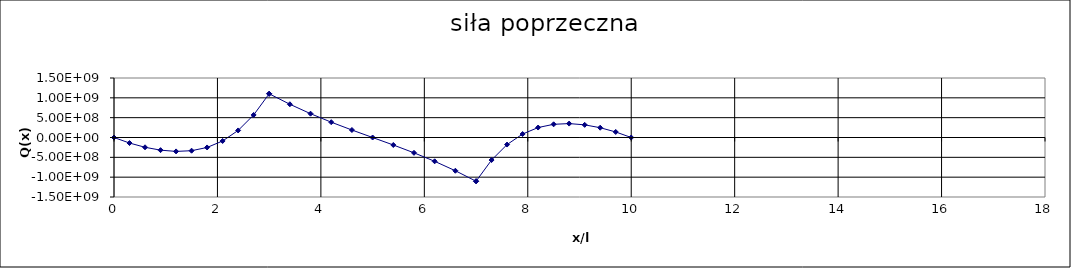
| Category | siła poprzeczna |
|---|---|
| 0.0 | 0 |
| 0.30000000000000004 | -139835703.15 |
| 0.6000000000000001 | -246874079 |
| 0.9000000000000001 | -318903123.721 |
| 1.2000000000000002 | -350586907.399 |
| 1.5 | -332543586.337 |
| 1.8000000000000003 | -250955038.448 |
| 2.1 | -87830555.821 |
| 2.4000000000000004 | 177896889.033 |
| 2.7 | 568211007.41 |
| 3.0 | 1102520820.284 |
| 3.0 | 1102520820.284 |
| 3.4 | 838033728.399 |
| 3.8 | 600603419.986 |
| 4.2 | 386314307.489 |
| 4.6 | 188774920.06 |
| 5.0 | 0 |
| 5.4 | -188774920.06 |
| 5.800000000000001 | -386314307.489 |
| 6.2 | -600603419.986 |
| 6.6 | -838033728.399 |
| 7.0 | -1102520820.284 |
| 7.0 | -1102520820.284 |
| 7.3 | -568211007.41 |
| 7.6 | -177896889.033 |
| 7.9 | 87830555.821 |
| 8.2 | 250955038.448 |
| 8.5 | 332543586.337 |
| 8.8 | 350586907.399 |
| 9.100000000000001 | 318903123.721 |
| 9.4 | 246874079 |
| 9.7 | 139835703.15 |
| 10.0 | 0 |